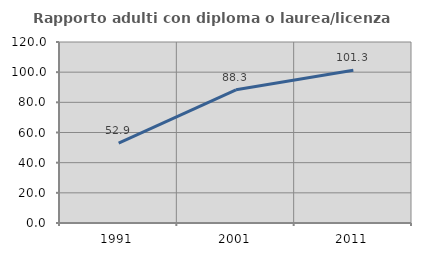
| Category | Rapporto adulti con diploma o laurea/licenza media  |
|---|---|
| 1991.0 | 52.893 |
| 2001.0 | 88.323 |
| 2011.0 | 101.333 |